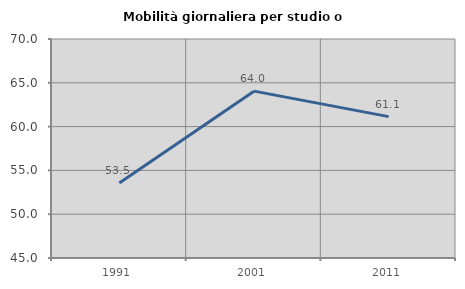
| Category | Mobilità giornaliera per studio o lavoro |
|---|---|
| 1991.0 | 53.549 |
| 2001.0 | 64.048 |
| 2011.0 | 61.14 |